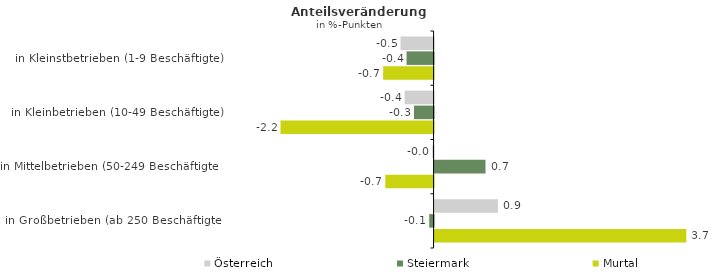
| Category | Österreich | Steiermark | Murtal |
|---|---|---|---|
| in Kleinstbetrieben (1-9 Beschäftigte) | -0.48 | -0.393 | -0.732 |
| in Kleinbetrieben (10-49 Beschäftigte) | -0.42 | -0.284 | -2.223 |
| in Mittelbetrieben (50-249 Beschäftigte) | -0.019 | 0.74 | -0.701 |
| in Großbetrieben (ab 250 Beschäftigte) | 0.919 | -0.063 | 3.656 |